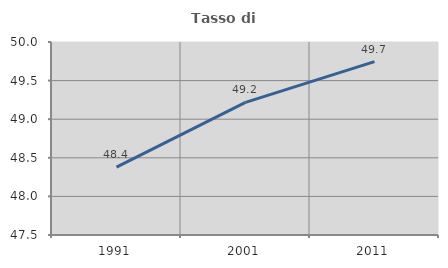
| Category | Tasso di occupazione   |
|---|---|
| 1991.0 | 48.378 |
| 2001.0 | 49.219 |
| 2011.0 | 49.745 |